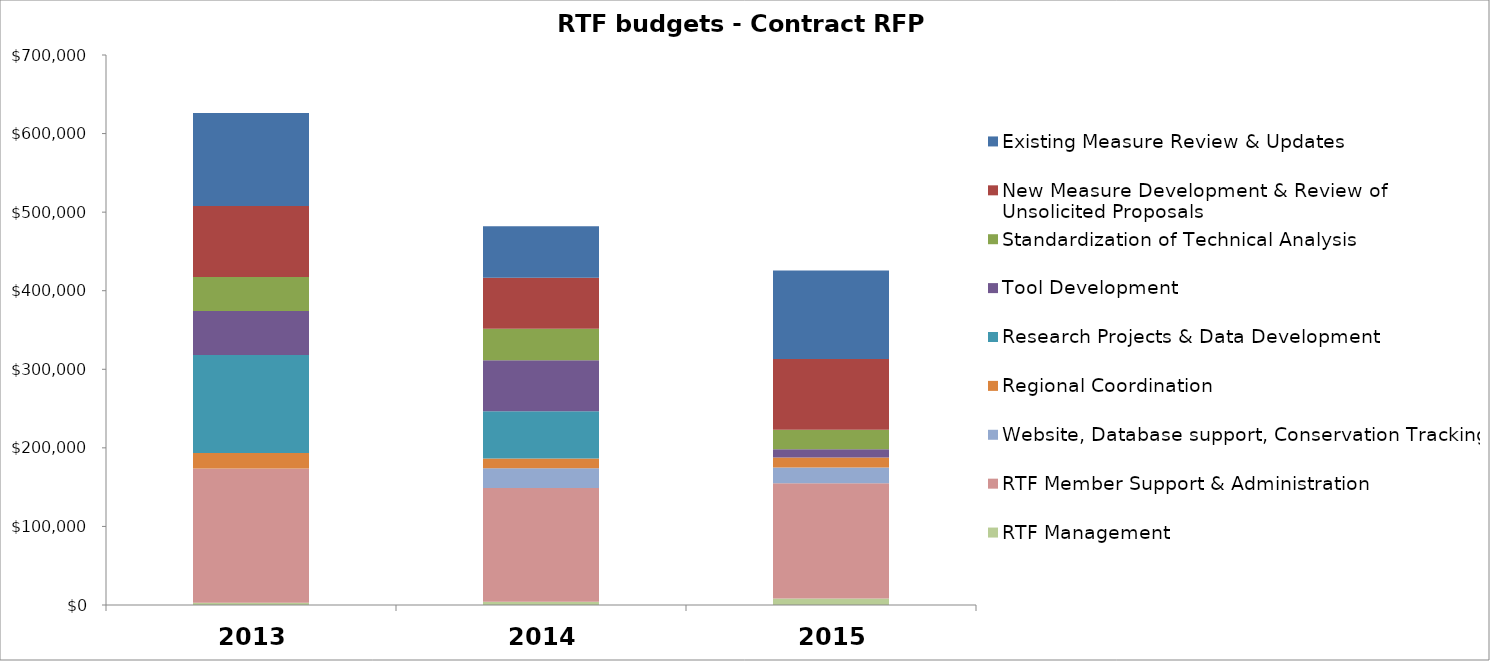
| Category | RTF Management | RTF Member Support & Administration | Website, Database support, Conservation Tracking  | Regional Coordination | Research Projects & Data Development | Tool Development | Standardization of Technical Analysis | New Measure Development & Review of Unsolicited Proposals | Existing Measure Review & Updates |
|---|---|---|---|---|---|---|---|---|---|
| 0 | 2946 | 170868 | 0 | 19640 | 124714 | 55974 | 43208 | 90344 | 118331 |
| 1 | 4000 | 145000 | 25000 | 12500 | 60000 | 65000 | 40000 | 65000 | 65500 |
| 2 | 8300 | 146800 | 20000 | 12500 | 0 | 10500 | 25000 | 90000 | 112500 |